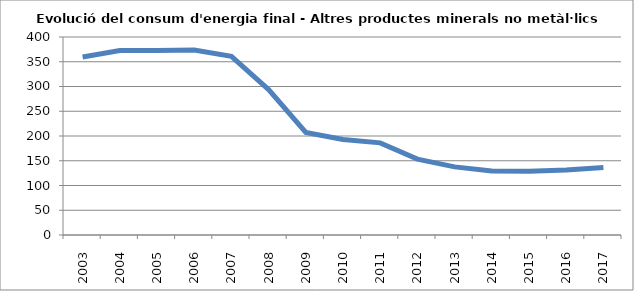
| Category | 359,7 372,5 372,5 373,5 360,9 293,7 207,4 193,0 186,1 153,3 137,6 129,5 128,9 131,2 136,3 |
|---|---|
| 2003.0 | 359.7 |
| 2004.0 | 372.5 |
| 2005.0 | 372.5 |
| 2006.0 | 373.5 |
| 2007.0 | 360.9 |
| 2008.0 | 293.7 |
| 2009.0 | 207.4 |
| 2010.0 | 193 |
| 2011.0 | 186.1 |
| 2012.0 | 153.3 |
| 2013.0 | 137.6 |
| 2014.0 | 129.5 |
| 2015.0 | 128.9 |
| 2016.0 | 131.2 |
| 2017.0 | 136.3 |